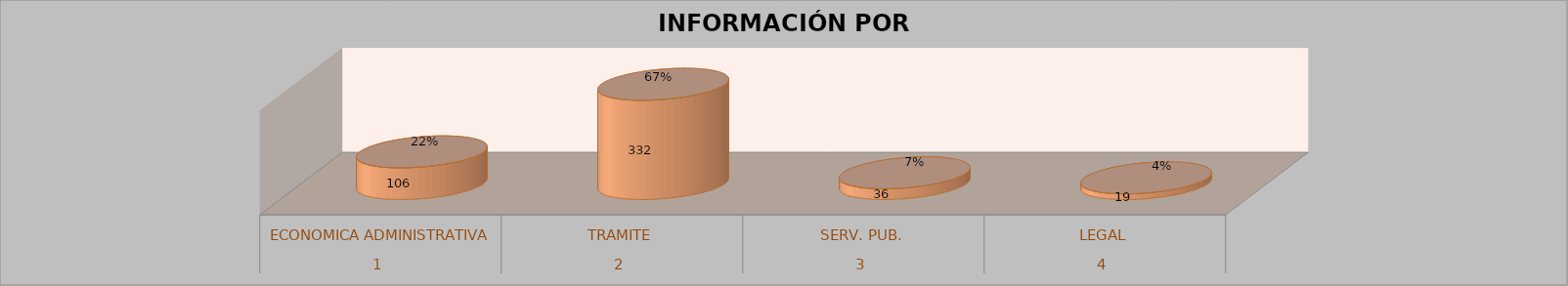
| Category | Series 0 | Series 1 | Series 2 | Series 3 |
|---|---|---|---|---|
| 0 |  |  | 106 | 0.215 |
| 1 |  |  | 332 | 0.673 |
| 2 |  |  | 36 | 0.073 |
| 3 |  |  | 19 | 0.039 |